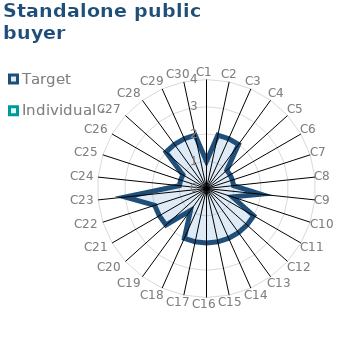
| Category | Target | Individual 4 |
|---|---|---|
| C1 | 1 | 0 |
| C2 | 2 | 0 |
| C3 | 2 | 0 |
| C4 | 2 | 0 |
| C5 | 1 | 0 |
| C6 | 1 | 0 |
| C7 | 1 | 0 |
| C8 | 1 | 0 |
| C9 | 2 | 0 |
| C10 | 1 | 0 |
| C11 | 2 | 0 |
| C12 | 2 | 0 |
| C13 | 2 | 0 |
| C14 | 2 | 0 |
| C15 | 2 | 0 |
| C16 | 2 | 0 |
| C17 | 2 | 0 |
| C18 | 2 | 0 |
| C19 | 1 | 0 |
| C20 | 2 | 0 |
| C21 | 2 | 0 |
| C22 | 2 | 0 |
| C23 | 3 | 0 |
| C24 | 1 | 0 |
| C25 | 1 | 0 |
| C26 | 1 | 0 |
| C27 | 2 | 0 |
| C28 | 2 | 0 |
| C29 | 2 | 0 |
| C30 | 2 | 0 |